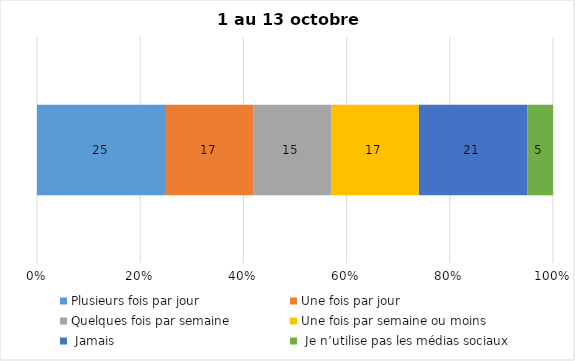
| Category | Plusieurs fois par jour | Une fois par jour | Quelques fois par semaine   | Une fois par semaine ou moins   |  Jamais   |  Je n’utilise pas les médias sociaux |
|---|---|---|---|---|---|---|
| 0 | 25 | 17 | 15 | 17 | 21 | 5 |